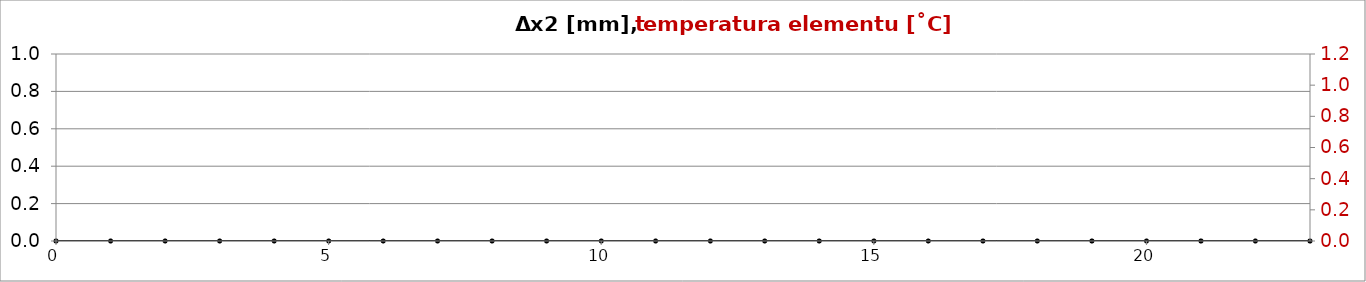
| Category | dx2 |
|---|---|
| 0.0 | 0 |
| 1.0 | 0 |
| 2.0 | 0 |
| 3.0 | 0 |
| 4.0 | 0 |
| 5.0 | 0 |
| 6.0 | 0 |
| 7.0 | 0 |
| 8.0 | 0 |
| 9.0 | 0 |
| 10.0 | 0 |
| 11.0 | 0 |
| 12.0 | 0 |
| 13.0 | 0 |
| 14.0 | 0 |
| 15.0 | 0 |
| 16.0 | 0 |
| 17.0 | 0 |
| 18.0 | 0 |
| 19.0 | 0 |
| 20.0 | 0 |
| 21.0 | 0 |
| 22.0 | 0 |
| 23.0 | 0 |